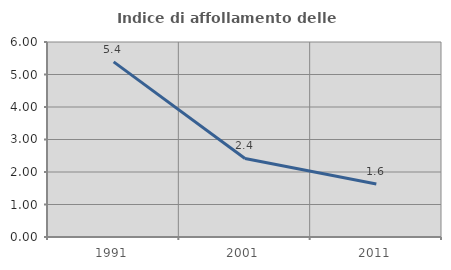
| Category | Indice di affollamento delle abitazioni  |
|---|---|
| 1991.0 | 5.389 |
| 2001.0 | 2.417 |
| 2011.0 | 1.633 |